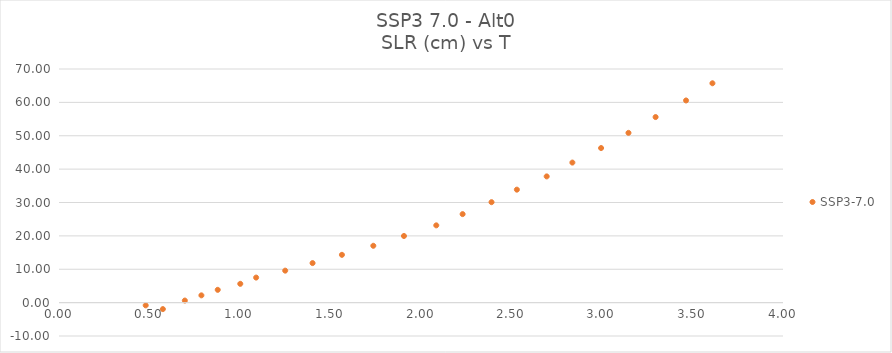
| Category | SSP3-7.0 |
|---|---|
| 0.573801925 | -1.941 |
| 0.479031654 | -0.818 |
| 0.695197934 | 0.621 |
| 0.786748548 | 2.18 |
| 0.877021499 | 3.834 |
| 1.001520332 | 5.633 |
| 1.089128948 | 7.505 |
| 1.249789297 | 9.582 |
| 1.40090264 | 11.846 |
| 1.563168575 | 14.321 |
| 1.736543554 | 17.03 |
| 1.905838217 | 19.967 |
| 2.084394689 | 23.152 |
| 2.229933662 | 26.519 |
| 2.38967776 | 30.098 |
| 2.529689917 | 33.847 |
| 2.694394026 | 37.818 |
| 2.836354375 | 41.963 |
| 2.994961126 | 46.317 |
| 3.14629165 | 50.865 |
| 3.296183387 | 55.604 |
| 3.46436976 | 60.573 |
| 3.610149607 | 65.724 |